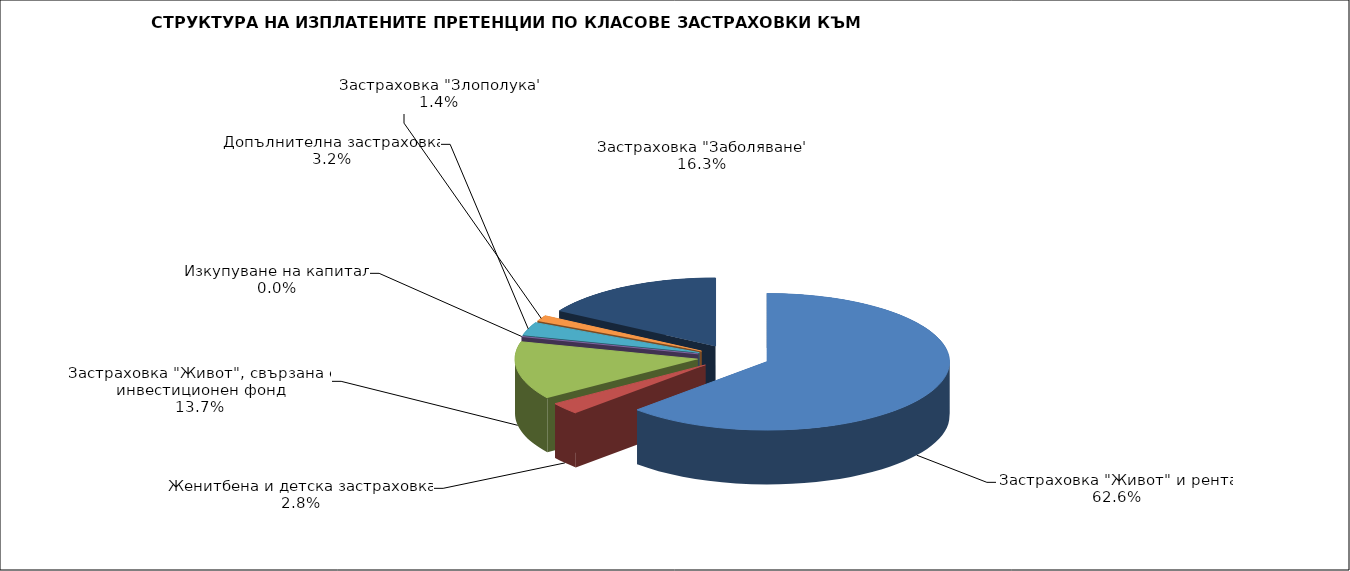
| Category | 45 832 685 |
|---|---|
| Застраховка "Живот" и рента | 45832684.655 |
| Женитбена и детска застраховка | 2068216.876 |
| Застраховка "Живот", свързана с инвестиционен фонд | 10044077.463 |
| Изкупуване на капитал | 0 |
| Допълнителна застраховка | 2314393.586 |
| Застраховка "Злополука" | 1020556.118 |
| Застраховка "Заболяване" | 11975977.175 |